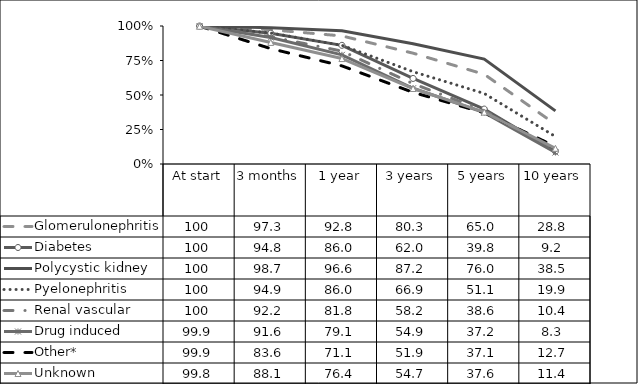
| Category | Glomerulonephritis | Diabetes | Polycystic kidney | Pyelonephritis | Renal vascular | Drug induced | Other* | Unknown |
|---|---|---|---|---|---|---|---|---|
| At start | 100 | 100 | 100 | 100 | 100 | 99.9 | 99.9 | 99.8 |
| 3 months | 97.3 | 94.8 | 98.7 | 94.9 | 92.2 | 91.6 | 83.6 | 88.1 |
| 1 year | 92.8 | 86 | 96.6 | 86 | 81.8 | 79.1 | 71.1 | 76.4 |
| 3 years | 80.3 | 62 | 87.2 | 66.9 | 58.2 | 54.9 | 51.9 | 54.7 |
| 5 years | 65 | 39.8 | 76 | 51.1 | 38.6 | 37.2 | 37.1 | 37.6 |
| 10 years | 28.8 | 9.2 | 38.5 | 19.9 | 10.4 | 8.3 | 12.7 | 11.4 |